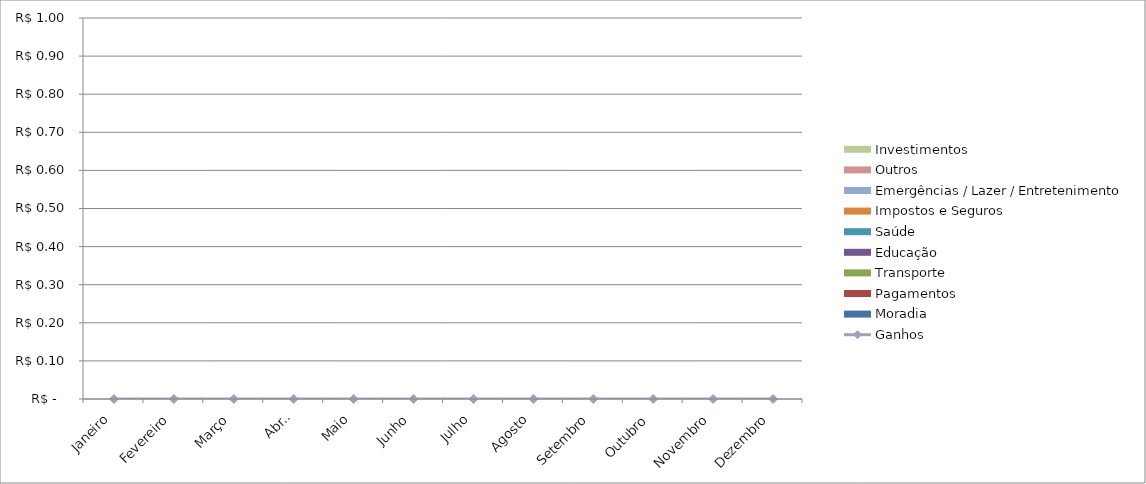
| Category | Ganhos |
|---|---|
| Janeiro | 0 |
| Fevereiro | 0 |
| Março | 0 |
| Abril | 0 |
| Maio | 0 |
| Junho | 0 |
| Julho | 0 |
| Agosto | 0 |
| Setembro | 0 |
| Outubro | 0 |
| Novembro | 0 |
| Dezembro | 0 |